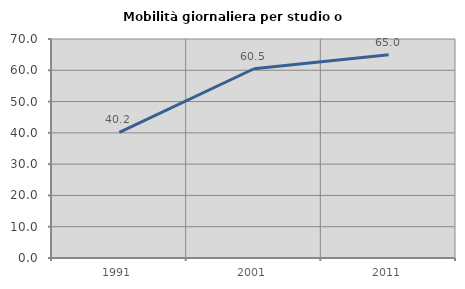
| Category | Mobilità giornaliera per studio o lavoro |
|---|---|
| 1991.0 | 40.168 |
| 2001.0 | 60.486 |
| 2011.0 | 64.972 |